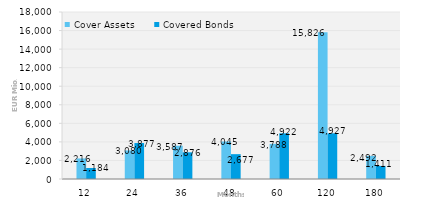
| Category | Cover Assets | Covered Bonds |
|---|---|---|
| 12.0 | 2215.603 | 1184.157 |
| 24.0 | 3080.47 | 3877 |
| 36.0 | 3586.791 | 2875.5 |
| 48.0 | 4045.163 | 2677 |
| 60.0 | 3787.917 | 4921.5 |
| 120.0 | 15826.47 | 4926.5 |
| 180.0 | 2492.118 | 1411 |